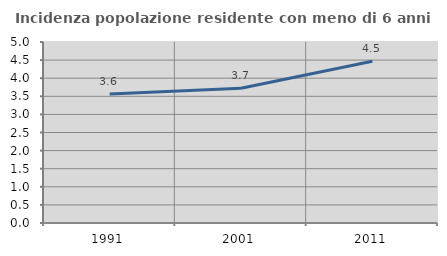
| Category | Incidenza popolazione residente con meno di 6 anni |
|---|---|
| 1991.0 | 3.562 |
| 2001.0 | 3.722 |
| 2011.0 | 4.466 |